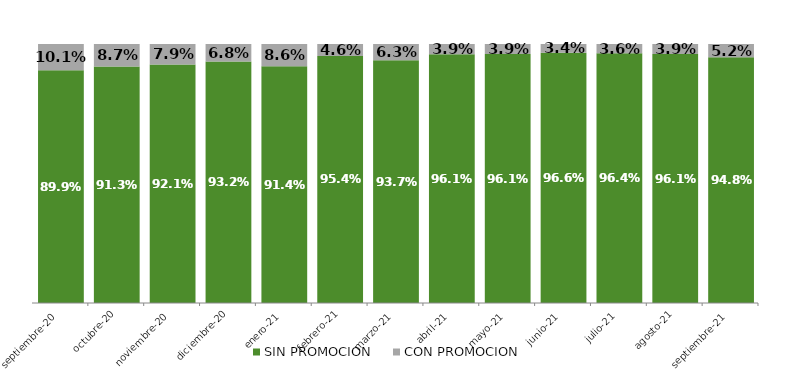
| Category | SIN PROMOCION   | CON PROMOCION   |
|---|---|---|
| 2020-09-01 | 0.899 | 0.101 |
| 2020-10-01 | 0.913 | 0.087 |
| 2020-11-01 | 0.921 | 0.079 |
| 2020-12-01 | 0.932 | 0.068 |
| 2021-01-01 | 0.914 | 0.086 |
| 2021-02-01 | 0.954 | 0.046 |
| 2021-03-01 | 0.937 | 0.063 |
| 2021-04-01 | 0.961 | 0.039 |
| 2021-05-01 | 0.961 | 0.039 |
| 2021-06-01 | 0.966 | 0.034 |
| 2021-07-01 | 0.964 | 0.036 |
| 2021-08-01 | 0.961 | 0.039 |
| 2021-09-01 | 0.948 | 0.052 |